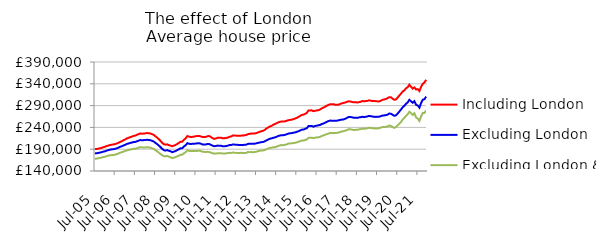
| Category | Including London | Excluding London | Excluding London & SE |
|---|---|---|---|
| 2005-07-01 | 190099.846 | 180338.943 | 168115.943 |
| 2005-08-01 | 190409.416 | 180707.116 | 168387.745 |
| 2005-09-01 | 191025.705 | 181294.079 | 169165.237 |
| 2005-10-01 | 192128.229 | 182260.003 | 170136.846 |
| 2005-11-01 | 193022.749 | 183020.557 | 170802.395 |
| 2005-12-01 | 194589.472 | 184321.051 | 171890.78 |
| 2006-01-01 | 195561.889 | 185223.855 | 172601.05 |
| 2006-02-01 | 197180.233 | 186694.526 | 173973.307 |
| 2006-03-01 | 198290.018 | 187883.534 | 175074.67 |
| 2006-04-01 | 199521.21 | 188954.872 | 175987.174 |
| 2006-05-01 | 200291.878 | 189620.06 | 176437.969 |
| 2006-06-01 | 200874.24 | 190048.53 | 176847.591 |
| 2006-07-01 | 201753.772 | 190830.896 | 177451.803 |
| 2006-08-01 | 202945.476 | 191932.237 | 178625.067 |
| 2006-09-01 | 204665.909 | 193486.107 | 180029.257 |
| 2006-10-01 | 206669.853 | 195431.198 | 181917.714 |
| 2006-11-01 | 208271.992 | 196704.296 | 182996.889 |
| 2006-12-01 | 210431.706 | 198484.218 | 184628.33 |
| 2007-01-01 | 212236.573 | 199867.99 | 185753.039 |
| 2007-02-01 | 214691.924 | 201953.448 | 187491.53 |
| 2007-03-01 | 215960.598 | 202950.014 | 188129.855 |
| 2007-04-01 | 217668.208 | 204390.327 | 189305.612 |
| 2007-05-01 | 218745.526 | 205176.529 | 190051.523 |
| 2007-06-01 | 220436.757 | 206350.676 | 190766.928 |
| 2007-07-01 | 221128.98 | 206601.586 | 190934.336 |
| 2007-08-01 | 222903.284 | 208023.687 | 191970.933 |
| 2007-09-01 | 224639.27 | 209648.69 | 193488.751 |
| 2007-10-01 | 225909.983 | 210886.574 | 194554.085 |
| 2007-11-01 | 225637.65 | 210701.658 | 194139.319 |
| 2007-12-01 | 225795.991 | 210808.016 | 194100.151 |
| 2008-01-01 | 226230.744 | 210997.948 | 193849.067 |
| 2008-02-01 | 227150.677 | 211685.752 | 194629.825 |
| 2008-03-01 | 226536.237 | 211131.036 | 194027.854 |
| 2008-04-01 | 226088.749 | 210687.499 | 193735.581 |
| 2008-05-01 | 224583.894 | 209243.33 | 192031.653 |
| 2008-06-01 | 222870.934 | 207605.676 | 190599.84 |
| 2008-07-01 | 219624.904 | 204552.197 | 187738.181 |
| 2008-08-01 | 216697.269 | 201783.679 | 185273.991 |
| 2008-09-01 | 213087.292 | 198550.708 | 182220.184 |
| 2008-10-01 | 209193.305 | 194954.131 | 179292.765 |
| 2008-11-01 | 204692.274 | 190946.059 | 176189.96 |
| 2008-12-01 | 201599.231 | 187849.92 | 174117.242 |
| 2009-01-01 | 200403.32 | 186878.072 | 173689.928 |
| 2009-02-01 | 201116.809 | 187902.199 | 174505.275 |
| 2009-03-01 | 199383.582 | 186328.236 | 172948.571 |
| 2009-04-01 | 198315.606 | 185259.882 | 171374.665 |
| 2009-05-01 | 196756.715 | 183093.397 | 169466.686 |
| 2009-06-01 | 198255.489 | 184493.743 | 170575.472 |
| 2009-07-01 | 199781.16 | 185725.435 | 171866.354 |
| 2009-08-01 | 202057.625 | 187894.019 | 173683.287 |
| 2009-09-01 | 204651.712 | 189897.228 | 175272.485 |
| 2009-10-01 | 206995.738 | 192147.604 | 177124.978 |
| 2009-11-01 | 207417.779 | 192401.732 | 177434.262 |
| 2009-12-01 | 211553.202 | 196348.095 | 180850.865 |
| 2010-01-01 | 214966.047 | 198975.275 | 183057.657 |
| 2010-02-01 | 220222.605 | 203842.442 | 187600.547 |
| 2010-03-01 | 218833.653 | 202417 | 186103.773 |
| 2010-04-01 | 218095.869 | 201947.595 | 185606.518 |
| 2010-05-01 | 218270.945 | 202369.228 | 185653.56 |
| 2010-06-01 | 219021.418 | 202622.997 | 185715.112 |
| 2010-07-01 | 219694.86 | 202909.807 | 185694.318 |
| 2010-08-01 | 220453.705 | 203427.774 | 186228.655 |
| 2010-09-01 | 220333.072 | 203554.602 | 186584.363 |
| 2010-10-01 | 219430.502 | 202646.38 | 185826.104 |
| 2010-11-01 | 217758.718 | 200820.946 | 184169.331 |
| 2010-12-01 | 217843.886 | 200598.076 | 183920.647 |
| 2011-01-01 | 218308.872 | 200845.74 | 183620.819 |
| 2011-02-01 | 219903.599 | 201942.266 | 184034.672 |
| 2011-03-01 | 220093.176 | 201787.31 | 183239.142 |
| 2011-04-01 | 217992.594 | 199967.499 | 182219.013 |
| 2011-05-01 | 215269.271 | 198004.825 | 180728.026 |
| 2011-06-01 | 213677.232 | 196824.513 | 179824.569 |
| 2011-07-01 | 214756.836 | 197366.561 | 180053.186 |
| 2011-08-01 | 216261.648 | 198273.54 | 180722.379 |
| 2011-09-01 | 216160.859 | 198017.112 | 180733.396 |
| 2011-10-01 | 216413 | 198044.687 | 180992.117 |
| 2011-11-01 | 215076.714 | 196723.016 | 179930.308 |
| 2011-12-01 | 215195.615 | 196619.922 | 180098.389 |
| 2012-01-01 | 215831.279 | 197197.229 | 180433.467 |
| 2012-02-01 | 216608.392 | 198028.239 | 181160.203 |
| 2012-03-01 | 218433.925 | 199448.115 | 181654.074 |
| 2012-04-01 | 219229.758 | 199570.129 | 181401.405 |
| 2012-05-01 | 221315.79 | 200758.529 | 182172.379 |
| 2012-06-01 | 221273.57 | 200554.841 | 182125.023 |
| 2012-07-01 | 221114.337 | 200270.358 | 181588.763 |
| 2012-08-01 | 220621.314 | 199950.2 | 181454.035 |
| 2012-09-01 | 220819.802 | 199578.294 | 181206.962 |
| 2012-10-01 | 221141.866 | 199928.213 | 181838.461 |
| 2012-11-01 | 221164.226 | 199365.164 | 181019.915 |
| 2012-12-01 | 221860.869 | 200187.818 | 181487.387 |
| 2013-01-01 | 222596.882 | 200321.308 | 181562.915 |
| 2013-02-01 | 224450.937 | 202165.818 | 183480.908 |
| 2013-03-01 | 225296.589 | 202321.905 | 183206.742 |
| 2013-04-01 | 225849.652 | 202728.281 | 183560.204 |
| 2013-05-01 | 225718.614 | 202362.124 | 182827.175 |
| 2013-06-01 | 226002.925 | 202691.089 | 183604.49 |
| 2013-07-01 | 226930.605 | 203452.386 | 184205.442 |
| 2013-08-01 | 228408.536 | 204423.05 | 185436.988 |
| 2013-09-01 | 229824.697 | 205278.944 | 186429.386 |
| 2013-10-01 | 231209.99 | 206154.794 | 187034.581 |
| 2013-11-01 | 232088.932 | 206444.18 | 187070.066 |
| 2013-12-01 | 234238.428 | 208094.651 | 188041.365 |
| 2014-01-01 | 237365.145 | 210155.879 | 189823.412 |
| 2014-02-01 | 239694.72 | 212174.554 | 191400.886 |
| 2014-03-01 | 242055.681 | 214012.688 | 192900.354 |
| 2014-04-01 | 243338.29 | 214775.303 | 193389.924 |
| 2014-05-01 | 245816.756 | 216038.374 | 194254.493 |
| 2014-06-01 | 247723.782 | 216873.628 | 194603.277 |
| 2014-07-01 | 249499.817 | 218444.174 | 195701.02 |
| 2014-08-01 | 251313.134 | 220200.2 | 197405.702 |
| 2014-09-01 | 252749.811 | 221247.959 | 198503.997 |
| 2014-10-01 | 253554.587 | 222116.231 | 199576.85 |
| 2014-11-01 | 253513.511 | 222004.979 | 199176.596 |
| 2014-12-01 | 253886.163 | 222912.5 | 200103.642 |
| 2015-01-01 | 255260.291 | 224151.478 | 201048.861 |
| 2015-02-01 | 256442.252 | 225640.668 | 202626.686 |
| 2015-03-01 | 257148.908 | 226552.252 | 203261.427 |
| 2015-04-01 | 257702.233 | 226857.13 | 203464.345 |
| 2015-05-01 | 258891.89 | 227735.502 | 204003.881 |
| 2015-06-01 | 260266.761 | 228497.388 | 204654.697 |
| 2015-07-01 | 261578.962 | 229583.14 | 205554.043 |
| 2015-08-01 | 264001.261 | 231254.691 | 207167.691 |
| 2015-09-01 | 265964.492 | 232711.522 | 208140.346 |
| 2015-10-01 | 268628.509 | 234826.4 | 209815.018 |
| 2015-11-01 | 269111.396 | 234960.65 | 209639.335 |
| 2015-12-01 | 271150.763 | 236640.113 | 211071.853 |
| 2016-01-01 | 273132.57 | 238155.033 | 212260.808 |
| 2016-02-01 | 278749.158 | 242942.359 | 215948.01 |
| 2016-03-01 | 279015.252 | 243059.927 | 216042.757 |
| 2016-04-01 | 279083.931 | 243156.96 | 216229.924 |
| 2016-05-01 | 277191.159 | 241777.856 | 215266.08 |
| 2016-06-01 | 278300.659 | 243277.523 | 216464.604 |
| 2016-07-01 | 278735.279 | 244000.624 | 216833.27 |
| 2016-08-01 | 279550.537 | 244824.223 | 217449.986 |
| 2016-09-01 | 281143.525 | 245745.556 | 218307.062 |
| 2016-10-01 | 283844.145 | 247892.088 | 220607.247 |
| 2016-11-01 | 285456.064 | 248896.599 | 221544.872 |
| 2016-12-01 | 287658.857 | 250984.14 | 223268.01 |
| 2017-01-01 | 289822.876 | 252856.968 | 224563.197 |
| 2017-02-01 | 291690.019 | 254624.594 | 226037.212 |
| 2017-03-01 | 293217.574 | 255694.681 | 227103.647 |
| 2017-04-01 | 293135.305 | 255292.47 | 226801.402 |
| 2017-05-01 | 293034.824 | 255419.745 | 227111.743 |
| 2017-06-01 | 291896.223 | 255008.621 | 226919.533 |
| 2017-07-01 | 291758.358 | 255528.067 | 227535.038 |
| 2017-08-01 | 292226.381 | 256292.983 | 228386.334 |
| 2017-09-01 | 294023.961 | 257274.595 | 229630.433 |
| 2017-10-01 | 295304.478 | 258022.621 | 230765.593 |
| 2017-11-01 | 296276.989 | 258364.335 | 231354.162 |
| 2017-12-01 | 297197.81 | 259939.638 | 232603.923 |
| 2018-01-01 | 298811.713 | 262071.424 | 234229.967 |
| 2018-02-01 | 300029.625 | 264099.346 | 235949.705 |
| 2018-03-01 | 299205.749 | 263836.12 | 235633.643 |
| 2018-04-01 | 298409.542 | 263175.091 | 234927.027 |
| 2018-05-01 | 297506.941 | 261851.64 | 233870.644 |
| 2018-06-01 | 297959.121 | 262280.237 | 234472.165 |
| 2018-07-01 | 297018.79 | 261760.695 | 234340.531 |
| 2018-08-01 | 297858.66 | 262927.093 | 235563.171 |
| 2018-09-01 | 298624.478 | 263218.429 | 235954.032 |
| 2018-10-01 | 300545.418 | 264469.385 | 237346.704 |
| 2018-11-01 | 299652.448 | 263523.362 | 236597.887 |
| 2018-12-01 | 300349.168 | 264311.745 | 237550.778 |
| 2019-01-01 | 300797.826 | 264937.704 | 237849.686 |
| 2019-02-01 | 302149.078 | 266418.975 | 239203.748 |
| 2019-03-01 | 301209.863 | 265776.004 | 238643.338 |
| 2019-04-01 | 300448.054 | 264869.293 | 238200.831 |
| 2019-05-01 | 300433.595 | 264305.857 | 237799.923 |
| 2019-06-01 | 300235.304 | 264098.537 | 237343.419 |
| 2019-07-01 | 299725.745 | 264203.148 | 237521.622 |
| 2019-08-01 | 299567.415 | 264552.195 | 238040.975 |
| 2019-09-01 | 301214.163 | 265749.854 | 239621.052 |
| 2019-10-01 | 303183.912 | 267081.618 | 240884.038 |
| 2019-11-01 | 304171.981 | 267442.68 | 240925.05 |
| 2019-12-01 | 305079.794 | 268190.042 | 241402.138 |
| 2020-01-01 | 306909.308 | 269092.466 | 241981.322 |
| 2020-02-01 | 309348.446 | 271687.481 | 244367.992 |
| 2020-03-01 | 309253.836 | 271478.218 | 243264.617 |
| 2020-04-01 | 305881.271 | 269065.7 | 240842.899 |
| 2020-05-01 | 303349.222 | 266620.132 | 238988.243 |
| 2020-06-01 | 303991.949 | 267517.675 | 240880.954 |
| 2020-07-01 | 308026.713 | 271463.133 | 244491.978 |
| 2020-08-01 | 312912.431 | 276135.938 | 248199.335 |
| 2020-09-01 | 317263.142 | 280742.953 | 252426.373 |
| 2020-10-01 | 322341.704 | 285930.492 | 257703.511 |
| 2020-11-01 | 324786.583 | 289337.69 | 261460.303 |
| 2020-12-01 | 329594.694 | 294058.125 | 266211.64 |
| 2021-01-01 | 332096.48 | 297190.485 | 269843.737 |
| 2021-02-01 | 337983.07 | 303258.626 | 275794.733 |
| 2021-03-01 | 333157.072 | 299982.444 | 272618.625 |
| 2021-04-01 | 328990.577 | 296522.215 | 268573.986 |
| 2021-05-01 | 331735.706 | 300120.927 | 272426.238 |
| 2021-06-01 | 326887.8 | 291891.578 | 262926.914 |
| 2021-07-01 | 327849.016 | 290328.828 | 260267.051 |
| 2021-08-01 | 323274.892 | 285211.061 | 254652.454 |
| 2021-09-01 | 333275.417 | 296137.47 | 265705.283 |
| 2021-10-01 | 339970.809 | 303530.3 | 273155.174 |
| 2021-11-01 | 343229.468 | 304716.344 | 273258.599 |
| 2021-12-01 | 349234.451 | 310629.09 | 278815.108 |